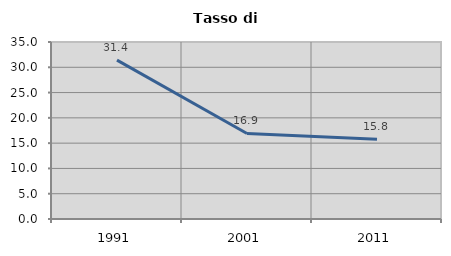
| Category | Tasso di disoccupazione   |
|---|---|
| 1991.0 | 31.408 |
| 2001.0 | 16.911 |
| 2011.0 | 15.759 |